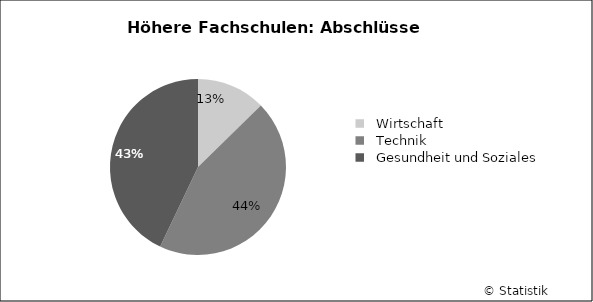
| Category | Series 0 |
|---|---|
|   Wirtschaft | 110 |
|   Technik | 386 |
|   Gesundheit und Soziales | 373 |